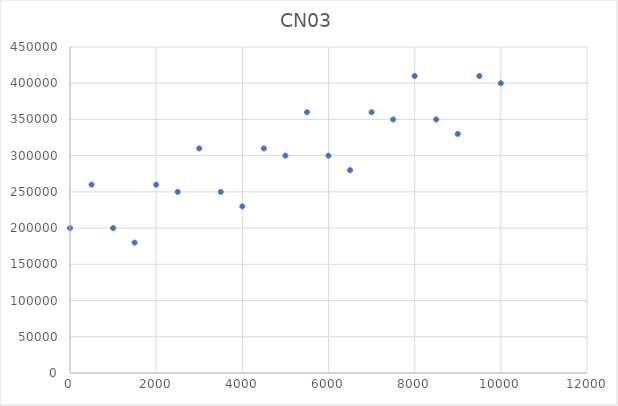
| Category | CN03 |
|---|---|
| 0.0 | 200000 |
| 500.0 | 260000 |
| 1000.0 | 200000 |
| 1500.0 | 180000 |
| 2000.0 | 260000 |
| 2500.0 | 250000 |
| 3000.0 | 310000 |
| 3500.0 | 250000 |
| 4000.0 | 230000 |
| 4500.0 | 310000 |
| 5000.0 | 300000 |
| 5500.0 | 360000 |
| 6000.0 | 300000 |
| 6500.0 | 280000 |
| 7000.0 | 360000 |
| 7500.0 | 350000 |
| 8000.0 | 410000 |
| 8500.0 | 350000 |
| 9000.0 | 330000 |
| 9500.0 | 410000 |
| 10000.0 | 400000 |